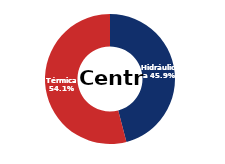
| Category | Centro |
|---|---|
| Eólica | 0 |
| Hidráulica | 1843.303 |
| Solar | 0 |
| Térmica | 2169.845 |